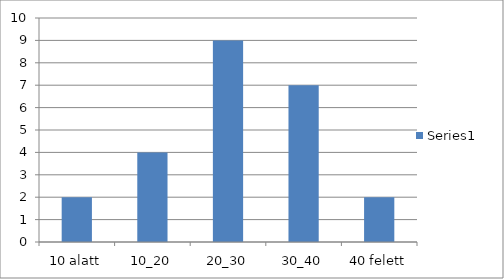
| Category | Series 0 |
|---|---|
| 10 alatt | 2 |
| 10_20 | 4 |
| 20_30 | 9 |
| 30_40 | 7 |
| 40 felett | 2 |